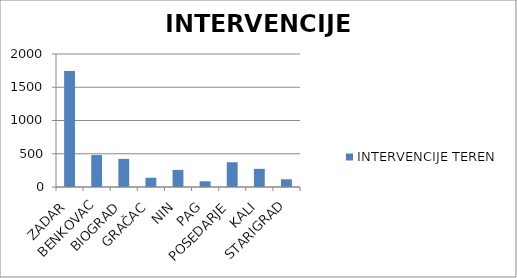
| Category | INTERVENCIJE TEREN |
|---|---|
| ZADAR | 1744 |
| BENKOVAC | 481 |
| BIOGRAD | 423 |
| GRAČAC | 139 |
| NIN | 257 |
| PAG | 86 |
| POSEDARJE | 372 |
| KALI | 273 |
| STARIGRAD | 116 |